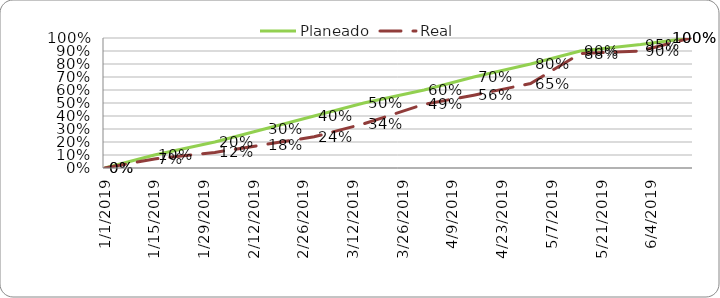
| Category | Planeado | Real |
|---|---|---|
| 1/1/19 | 0 | 0 |
| 1/15/19 | 0.1 | 0.07 |
| 2/1/19 | 0.2 | 0.12 |
| 2/15/19 | 0.3 | 0.18 |
| 3/1/19 | 0.4 | 0.24 |
| 3/15/19 | 0.5 | 0.34 |
| 4/1/19 | 0.6 | 0.49 |
| 4/15/19 | 0.7 | 0.56 |
| 5/1/19 | 0.8 | 0.65 |
| 5/15/19 | 0.9 | 0.88 |
| 6/1/19 | 0.95 | 0.9 |
| 6/15/19 | 1 | 1 |